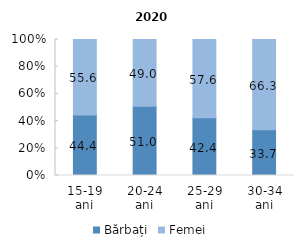
| Category | Bărbați | Femei |
|---|---|---|
| 15-19 ani | 44.4 | 55.6 |
| 20-24 ani | 51 | 49 |
| 25-29 ani | 42.4 | 57.6 |
| 30-34 ani | 33.7 | 66.3 |